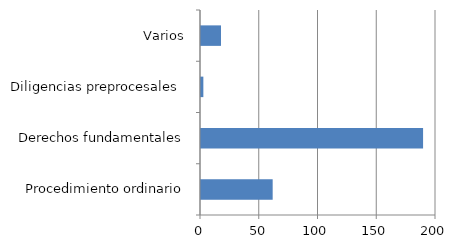
| Category | Series 0 |
|---|---|
| Procedimiento ordinario | 61 |
| Derechos fundamentales | 189 |
| Diligencias preprocesales  | 2 |
| Varios | 17 |